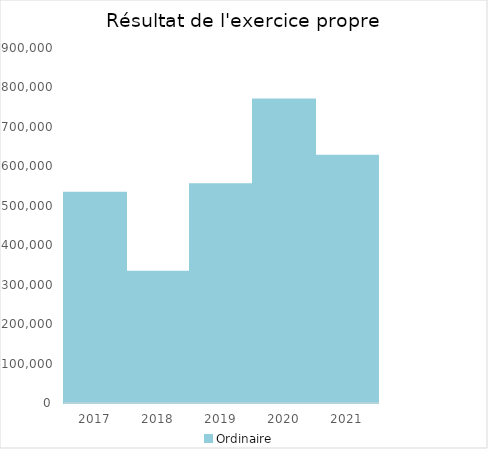
| Category |   | Ordinaire |    |
|---|---|---|---|
| 2017.0 |  | 532748.96 |  |
| 2018.0 |  | 332590.47 |  |
| 2019.0 |  | 554509.1 |  |
| 2020.0 |  | 769242.83 |  |
| 2021.0 |  | 627106.05 |  |